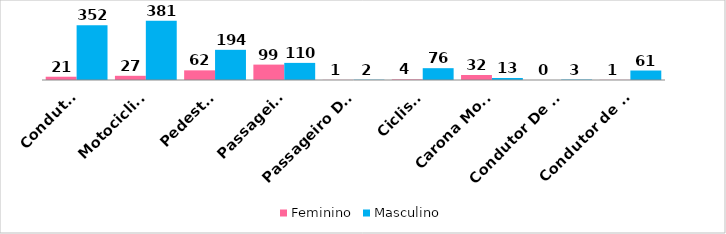
| Category | Feminino | Masculino |
|---|---|---|
| Condutor | 21 | 352 |
| Motociclista | 27 | 381 |
| Pedestre | 62 | 194 |
| Passageiro | 99 | 110 |
| Passageiro De Ônibus | 1 | 2 |
| Ciclista | 4 | 76 |
| Carona Moto | 32 | 13 |
| Condutor De Trator | 0 | 3 |
| Condutor de Caminhão | 1 | 61 |